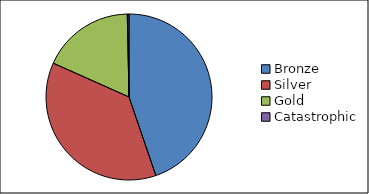
| Category | Total |
|---|---|
| Bronze | 55467 |
| Silver | 45774 |
| Gold | 22282 |
| Catastrophic | 414 |